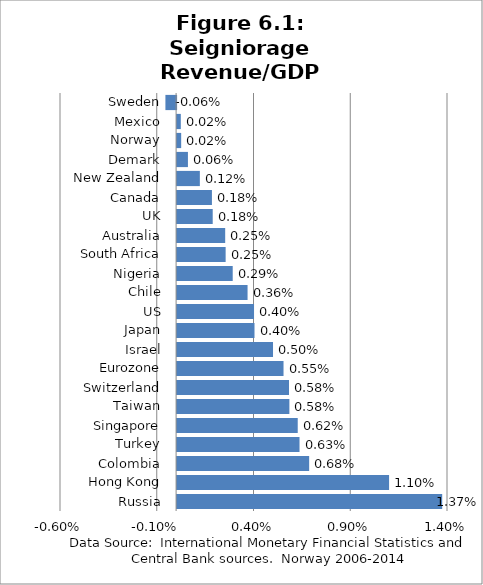
| Category | Series 0 |
|---|---|
| Russia | 0.014 |
| Hong Kong | 0.011 |
| Colombia | 0.007 |
| Turkey | 0.006 |
| Singapore | 0.006 |
| Taiwan | 0.006 |
| Switzerland | 0.006 |
| Eurozone | 0.006 |
| Israel | 0.005 |
| Japan | 0.004 |
| US | 0.004 |
| Chile | 0.004 |
| Nigeria | 0.003 |
| South Africa | 0.003 |
| Australia | 0.002 |
| UK | 0.002 |
| Canada | 0.002 |
| New Zealand | 0.001 |
| Demark | 0.001 |
| Norway | 0 |
| Mexico | 0 |
| Sweden | -0.001 |